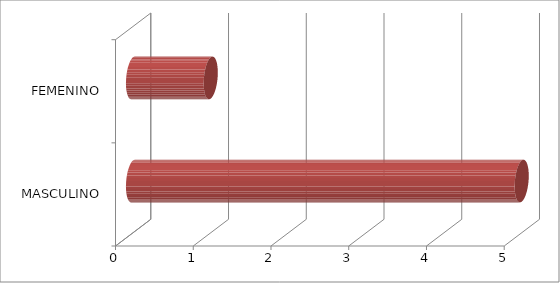
| Category | Series 0 |
|---|---|
| MASCULINO | 5 |
| FEMENINO | 1 |